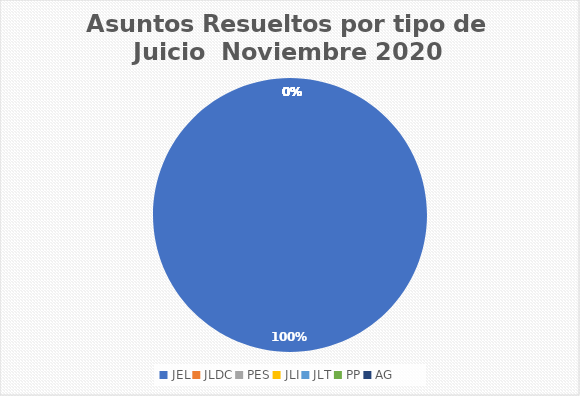
| Category | Asuntos Resueltos por tipo de Juicio  Noviembre |
|---|---|
| JEL | 21 |
| JLDC | 0 |
| PES | 0 |
| JLI | 0 |
| JLT | 0 |
| PP | 0 |
| AG | 0 |